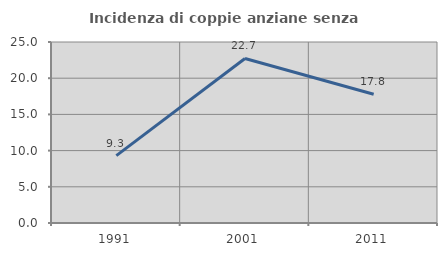
| Category | Incidenza di coppie anziane senza figli  |
|---|---|
| 1991.0 | 9.302 |
| 2001.0 | 22.727 |
| 2011.0 | 17.778 |